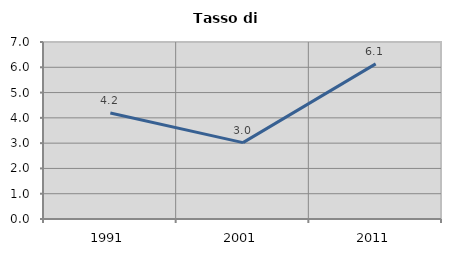
| Category | Tasso di disoccupazione   |
|---|---|
| 1991.0 | 4.189 |
| 2001.0 | 3.019 |
| 2011.0 | 6.133 |